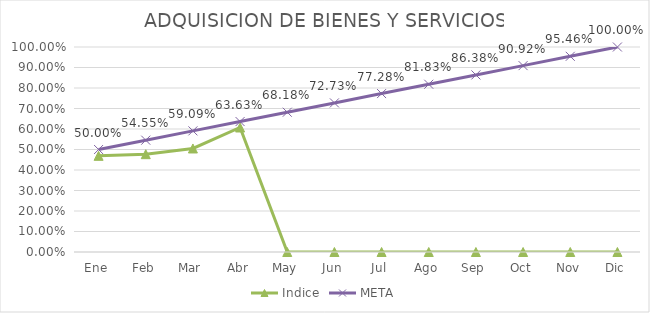
| Category | Indice | META |
|---|---|---|
| Ene | 0.469 | 0.5 |
| Feb | 0.477 | 0.546 |
| Mar | 0.505 | 0.591 |
| Abr | 0.607 | 0.636 |
| May | 0 | 0.682 |
| Jun | 0 | 0.727 |
| Jul | 0 | 0.773 |
| Ago | 0 | 0.818 |
| Sep | 0 | 0.864 |
| Oct | 0 | 0.909 |
| Nov | 0 | 0.955 |
| Dic | 0 | 1 |